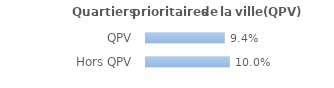
| Category | Series 0 |
|---|---|
| QPV | 0.094 |
| Hors QPV | 0.1 |